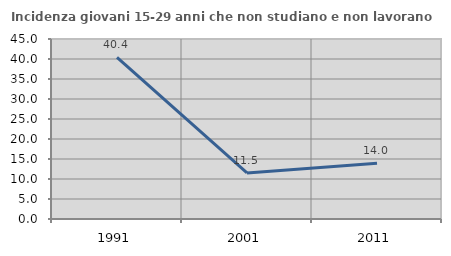
| Category | Incidenza giovani 15-29 anni che non studiano e non lavorano  |
|---|---|
| 1991.0 | 40.397 |
| 2001.0 | 11.522 |
| 2011.0 | 13.966 |